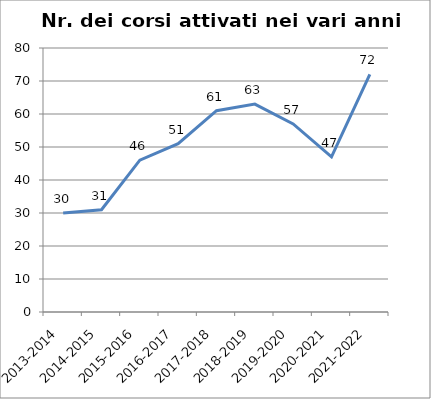
| Category | Nr. Corsi Attivati |
|---|---|
| 2013-2014 | 30 |
| 2014-2015 | 31 |
| 2015-2016 | 46 |
| 2016-2017 | 51 |
| 2017-2018 | 61 |
| 2018-2019 | 63 |
| 2019-2020 | 57 |
| 2020-2021 | 47 |
| 2021-2022 | 72 |